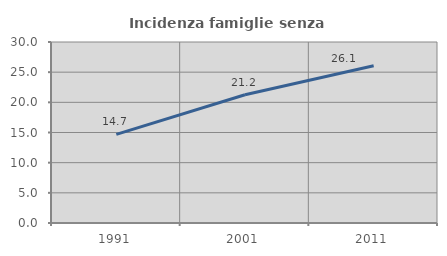
| Category | Incidenza famiglie senza nuclei |
|---|---|
| 1991.0 | 14.687 |
| 2001.0 | 21.248 |
| 2011.0 | 26.077 |